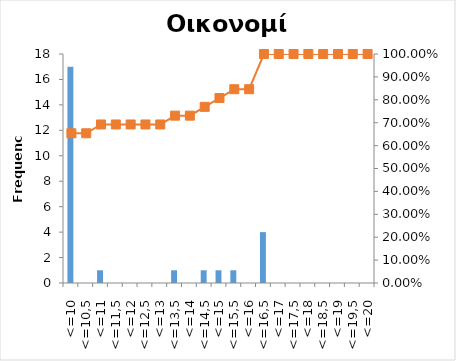
| Category | Series 0 |
|---|---|
| <=10 | 17 |
| <=10,5 | 0 |
| <=11 | 1 |
| <=11,5 | 0 |
| <=12 | 0 |
| <=12,5 | 0 |
| <=13 | 0 |
| <=13,5 | 1 |
| <=14 | 0 |
| <=14,5 | 1 |
| <=15 | 1 |
| <=15,5 | 1 |
| <=16 | 0 |
| <=16,5 | 4 |
| <=17 | 0 |
| <=17,5 | 0 |
| <=18 | 0 |
| <=18,5 | 0 |
| <=19 | 0 |
| <=19,5 | 0 |
| <=20 | 0 |